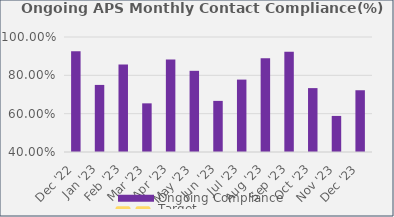
| Category | Ongoing Compliance |
|---|---|
| Dec '22 | 0.926 |
| Jan '23 | 0.75 |
| Feb '23 | 0.857 |
| Mar '23 | 0.654 |
| Apr '23 | 0.882 |
| May '23 | 0.824 |
| Jun '23 | 0.667 |
| Jul '23 | 0.778 |
| Aug '23 | 0.889 |
| Sep '23 | 0.923 |
| Oct '23 | 0.733 |
| Nov '23 | 0.588 |
| Dec '23 | 0.722 |